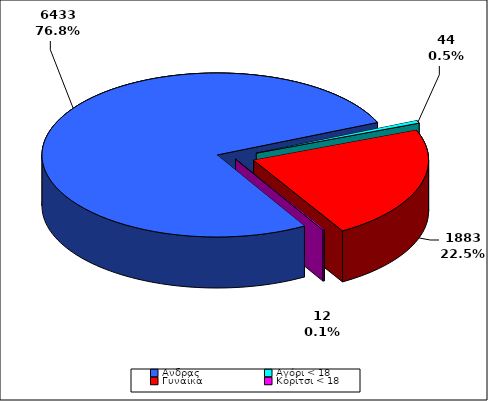
| Category | ΣΥΝΟΛΟ |
|---|---|
| Aνδρας | 6433 |
| Αγόρι < 18 | 44 |
| Γυναίκα | 1883 |
| Κορίτσι < 18 | 12 |